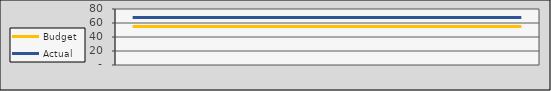
| Category | Budget | Actual |
|---|---|---|
| 2020-07-01 | 55 | 68 |
| 2020-08-01 | 55 | 68 |
| 2020-09-01 | 55 | 68 |
| 2020-10-02 | 55 | 68 |
| 2020-11-02 | 55 | 68 |
| 2020-12-03 | 55 | 68 |
| 2021-01-03 | 55 | 68 |
| 2021-02-03 | 55 | 68 |
| 2021-03-06 | 55 | 68 |
| 2021-04-06 | 55 | 68 |
| 2021-05-07 | 55 | 68 |
| 2021-06-07 | 55 | 68 |